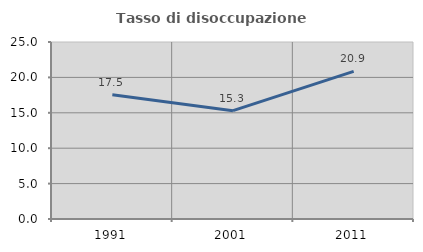
| Category | Tasso di disoccupazione giovanile  |
|---|---|
| 1991.0 | 17.549 |
| 2001.0 | 15.301 |
| 2011.0 | 20.859 |